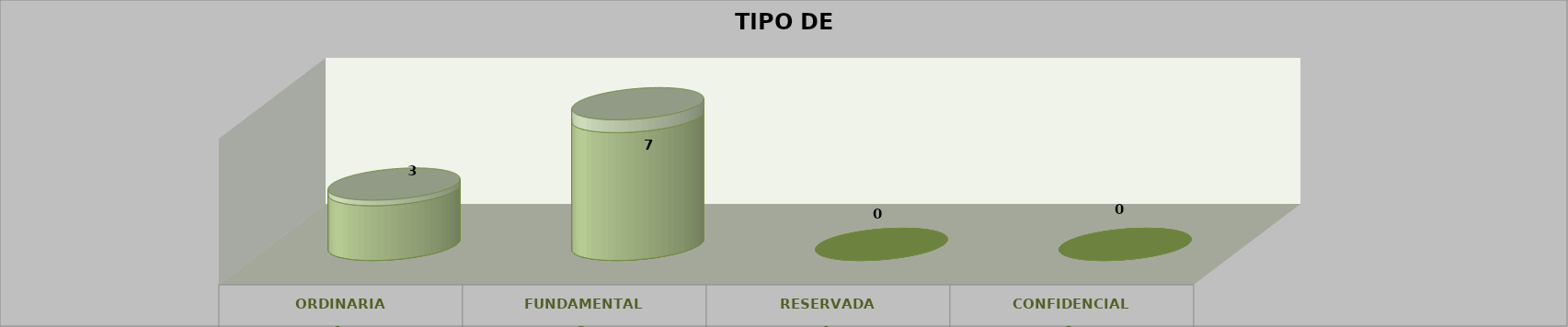
| Category | Series 0 | Series 2 | Series 1 | Series 3 | Series 4 |
|---|---|---|---|---|---|
| 0 |  |  |  | 3 | 0.3 |
| 1 |  |  |  | 7 | 0.7 |
| 2 |  |  |  | 0 | 0 |
| 3 |  |  |  | 0 | 0 |